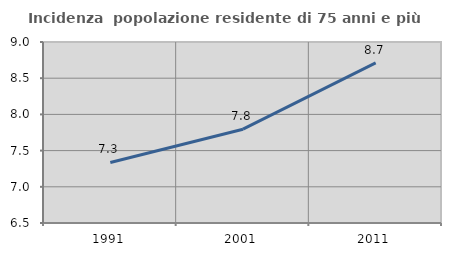
| Category | Incidenza  popolazione residente di 75 anni e più |
|---|---|
| 1991.0 | 7.336 |
| 2001.0 | 7.796 |
| 2011.0 | 8.713 |